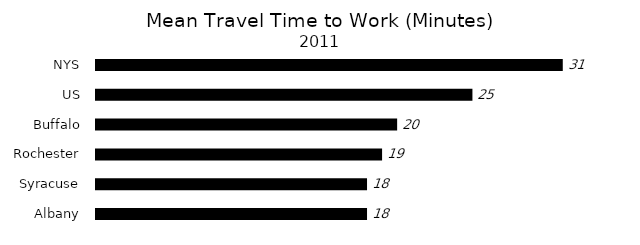
| Category | Series 0 |
|---|---|
| Albany | 18 |
| Syracuse | 18 |
| Rochester | 19 |
| Buffalo | 20 |
| US | 25 |
| NYS | 31 |